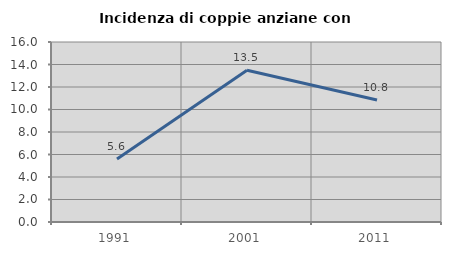
| Category | Incidenza di coppie anziane con figli |
|---|---|
| 1991.0 | 5.607 |
| 2001.0 | 13.483 |
| 2011.0 | 10.843 |